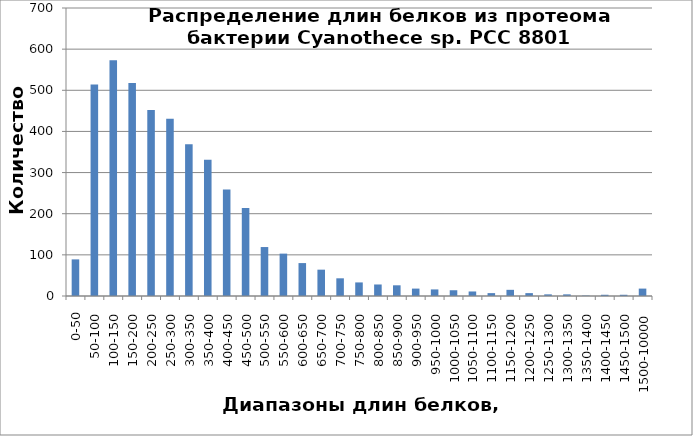
| Category | Распределение длин белков |
|---|---|
| 0-50 | 89 |
| 50-100 | 514 |
| 100-150 | 573 |
| 150-200 | 518 |
| 200-250 | 452 |
| 250-300 | 431 |
| 300-350 | 369 |
| 350-400 | 331 |
| 400-450 | 259 |
| 450-500 | 214 |
| 500-550 | 119 |
| 550-600 | 103 |
| 600-650 | 80 |
| 650-700 | 64 |
| 700-750 | 43 |
| 750-800 | 33 |
| 800-850 | 28 |
| 850-900 | 26 |
| 900-950 | 18 |
| 950-1000 | 16 |
| 1000-1050 | 14 |
| 1050-1100 | 11 |
| 1100-1150 | 7 |
| 1150-1200 | 15 |
| 1200-1250 | 7 |
| 1250-1300 | 4 |
| 1300-1350 | 4 |
| 1350-1400 | 1 |
| 1400-1450 | 3 |
| 1450-1500 | 3 |
| 1500-10000 | 18 |